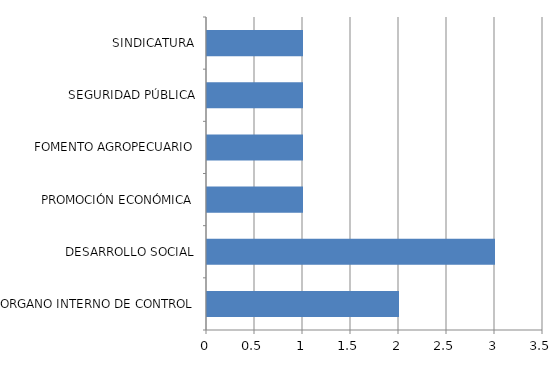
| Category | Series 0 |
|---|---|
| ORGANO INTERNO DE CONTROL | 2 |
| DESARROLLO SOCIAL | 3 |
| PROMOCIÓN ECONÓMICA | 1 |
| FOMENTO AGROPECUARIO | 1 |
| SEGURIDAD PÚBLICA | 1 |
| SINDICATURA | 1 |